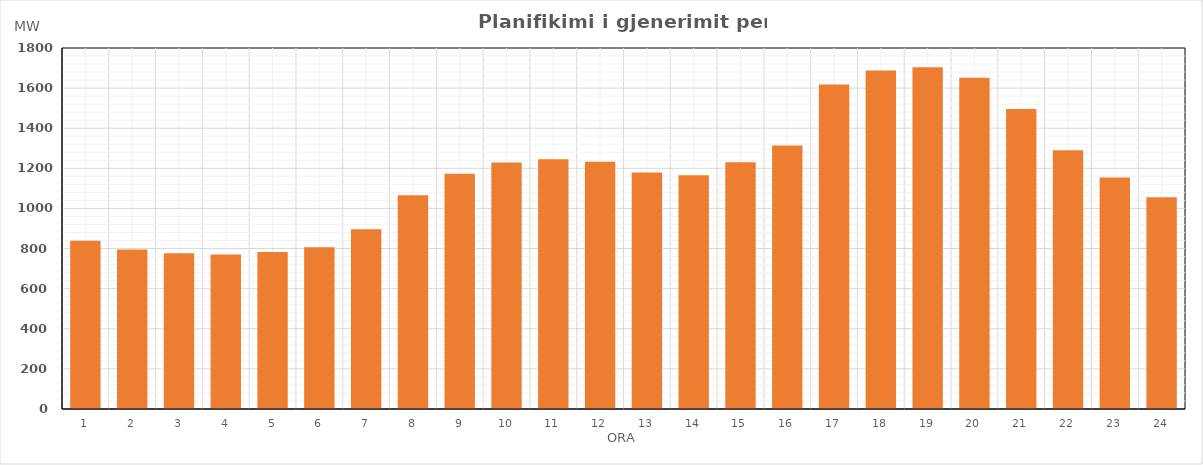
| Category | Max (MW) |
|---|---|
| 0 | 838.95 |
| 1 | 795.16 |
| 2 | 776.31 |
| 3 | 770.5 |
| 4 | 782.49 |
| 5 | 806.79 |
| 6 | 896.49 |
| 7 | 1065.9 |
| 8 | 1172.61 |
| 9 | 1229.58 |
| 10 | 1245.71 |
| 11 | 1232.21 |
| 12 | 1179.67 |
| 13 | 1165.99 |
| 14 | 1230.84 |
| 15 | 1313.32 |
| 16 | 1618.31 |
| 17 | 1687.93 |
| 18 | 1703.85 |
| 19 | 1651.75 |
| 20 | 1496.27 |
| 21 | 1289.93 |
| 22 | 1154.74 |
| 23 | 1056.07 |